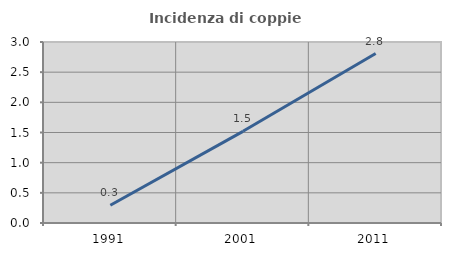
| Category | Incidenza di coppie miste |
|---|---|
| 1991.0 | 0.293 |
| 2001.0 | 1.519 |
| 2011.0 | 2.809 |